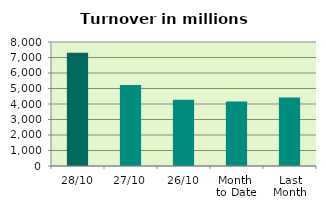
| Category | Series 0 |
|---|---|
| 28/10 | 7309.62 |
| 27/10 | 5222.286 |
| 26/10 | 4272.887 |
| Month 
to Date | 4167.934 |
| Last
Month | 4425.778 |